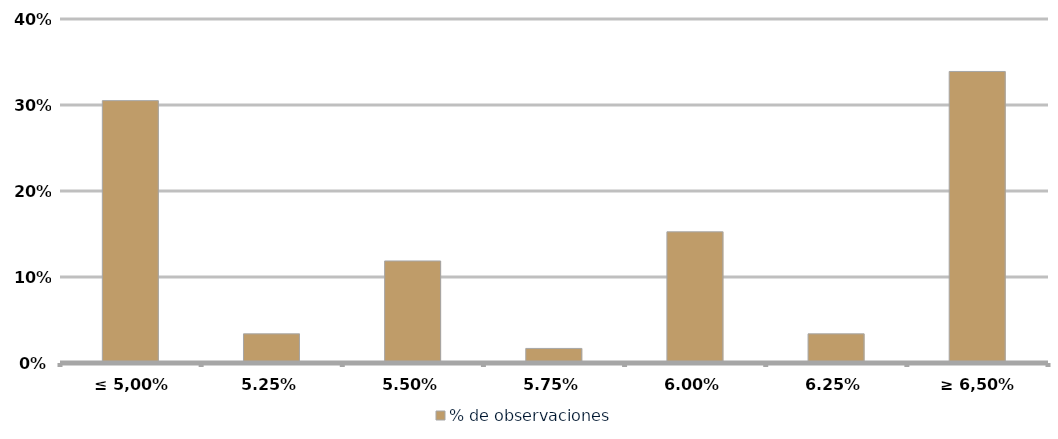
| Category | % de observaciones  |
|---|---|
| ≤ 5,00% | 0.305 |
| 5,25% | 0.034 |
| 5,50% | 0.119 |
| 5,75% | 0.017 |
| 6,00% | 0.153 |
| 6,25% | 0.034 |
| ≥ 6,50% | 0.339 |